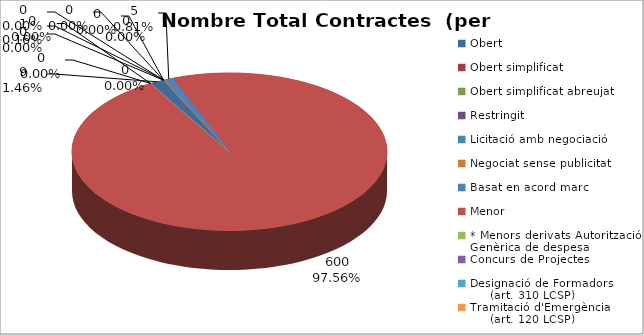
| Category | Nombre Total Contractes |
|---|---|
| Obert | 9 |
| Obert simplificat | 0 |
| Obert simplificat abreujat | 0 |
| Restringit | 0 |
| Licitació amb negociació | 0 |
| Negociat sense publicitat | 1 |
| Basat en acord marc | 5 |
| Menor | 600 |
| * Menors derivats Autorització Genèrica de despesa | 0 |
| Concurs de Projectes | 0 |
| Designació de Formadors
     (art. 310 LCSP) | 0 |
| Tramitació d'Emergència
     (art. 120 LCSP) | 0 |